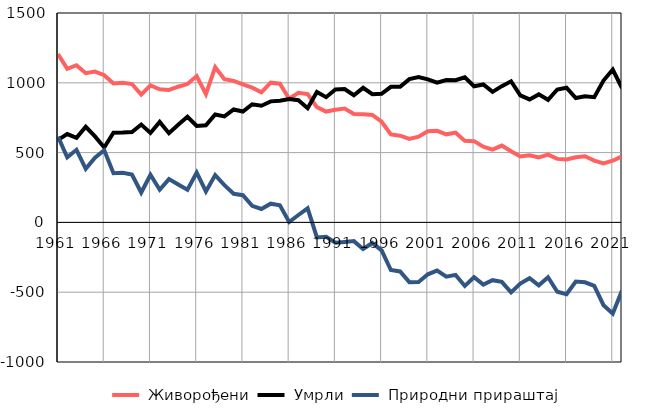
| Category |  Живорођени |  Умрли |  Природни прираштај |
|---|---|---|---|
| 1961.0 | 1205 | 591 | 614 |
| 1962.0 | 1100 | 633 | 467 |
| 1963.0 | 1126 | 606 | 520 |
| 1964.0 | 1069 | 685 | 384 |
| 1965.0 | 1080 | 616 | 464 |
| 1966.0 | 1054 | 537 | 517 |
| 1967.0 | 995 | 643 | 352 |
| 1968.0 | 1000 | 644 | 356 |
| 1969.0 | 991 | 648 | 343 |
| 1970.0 | 915 | 701 | 214 |
| 1971.0 | 982 | 641 | 341 |
| 1972.0 | 954 | 720 | 234 |
| 1973.0 | 949 | 639 | 310 |
| 1974.0 | 972 | 700 | 272 |
| 1975.0 | 991 | 757 | 234 |
| 1976.0 | 1048 | 691 | 357 |
| 1977.0 | 918 | 696 | 222 |
| 1978.0 | 1112 | 773 | 339 |
| 1979.0 | 1026 | 759 | 267 |
| 1980.0 | 1014 | 809 | 205 |
| 1981.0 | 989 | 794 | 195 |
| 1982.0 | 965 | 846 | 119 |
| 1983.0 | 932 | 836 | 96 |
| 1984.0 | 1001 | 867 | 134 |
| 1985.0 | 994 | 872 | 122 |
| 1986.0 | 886 | 883 | 3 |
| 1987.0 | 928 | 875 | 53 |
| 1988.0 | 919 | 818 | 101 |
| 1989.0 | 826 | 934 | -108 |
| 1990.0 | 794 | 897 | -103 |
| 1991.0 | 807 | 952 | -145 |
| 1992.0 | 815 | 955 | -140 |
| 1993.0 | 777 | 911 | -134 |
| 1994.0 | 774 | 964 | -190 |
| 1995.0 | 770 | 918 | -148 |
| 1996.0 | 721 | 921 | -200 |
| 1997.0 | 630 | 971 | -341 |
| 1998.0 | 621 | 972 | -351 |
| 1999.0 | 598 | 1026 | -428 |
| 2000.0 | 614 | 1041 | -427 |
| 2001.0 | 653 | 1025 | -372 |
| 2002.0 | 656 | 1001 | -345 |
| 2003.0 | 631 | 1020 | -389 |
| 2004.0 | 643 | 1019 | -376 |
| 2005.0 | 584 | 1039 | -455 |
| 2006.0 | 582 | 975 | -393 |
| 2007.0 | 542 | 988 | -446 |
| 2008.0 | 521 | 935 | -414 |
| 2009.0 | 550 | 976 | -426 |
| 2010.0 | 510 | 1011 | -501 |
| 2011.0 | 472 | 910 | -438 |
| 2012.0 | 481 | 881 | -400 |
| 2013.0 | 466 | 917 | -451 |
| 2014.0 | 485 | 878 | -393 |
| 2015.0 | 455 | 952 | -497 |
| 2016.0 | 451 | 965 | -514 |
| 2017.0 | 467 | 891 | -424 |
| 2018.0 | 474 | 903 | -429 |
| 2019.0 | 443 | 897 | -454 |
| 2020.0 | 423 | 1016 | -593 |
| 2021.0 | 442 | 1095 | -653 |
| 2022.0 | 474 | 962 | -488 |